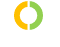
| Category | Series 0 |
|---|---|
| 0 | 1 |
| 1 | 1 |
| 2 | 0 |